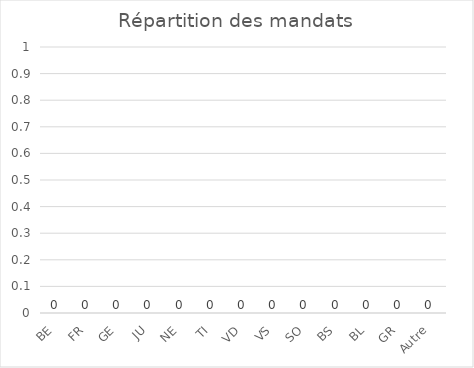
| Category | Series 0 |
|---|---|
| BE | 0 |
| FR | 0 |
| GE | 0 |
| JU | 0 |
| NE | 0 |
| TI | 0 |
| VD | 0 |
| VS | 0 |
| SO | 0 |
| BS | 0 |
| BL | 0 |
| GR | 0 |
| Autre | 0 |